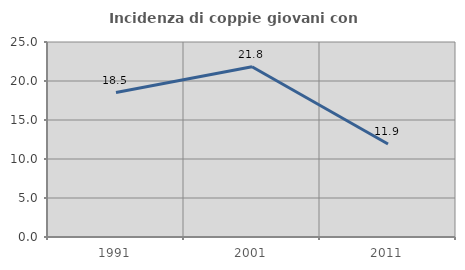
| Category | Incidenza di coppie giovani con figli |
|---|---|
| 1991.0 | 18.519 |
| 2001.0 | 21.818 |
| 2011.0 | 11.932 |